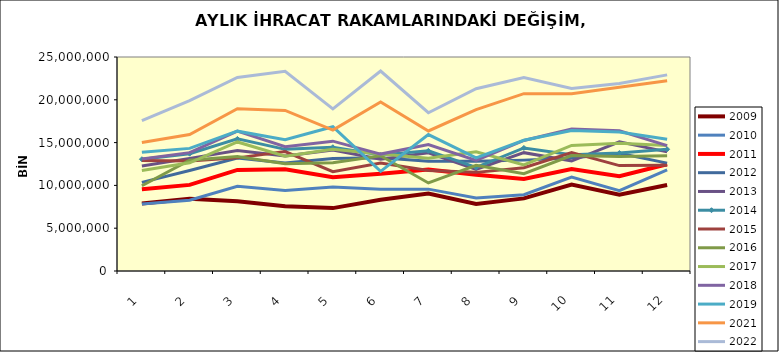
| Category | 2009 | 2010 | 2011 | 2012 | 2013 | 2014 | 2015 | 2016 | 2017 | 2018 | 2019 | 2021 | 2022 |
|---|---|---|---|---|---|---|---|---|---|---|---|---|---|
| 0 | 7884493.524 | 7828748.058 | 9551084.639 | 10348187.166 | 12263324.263 | 13056096.762 | 12910127.485 | 9956568.792 | 11738727.564 | 13080096.762 | 13874826.012 | 15003935.219 | 17553932.872 |
| 1 | 8435115.834 | 8263237.814 | 10059126.307 | 11748000.124 | 13155175.588 | 13707842.597 | 12846416.717 | 12939347.18 | 12643609.013 | 13827132.655 | 14323043.042 | 15952528.858 | 19904576.483 |
| 2 | 8155485.081 | 9886488.171 | 11811085.16 | 13208572.977 | 14066303.609 | 15431727.477 | 13215986.349 | 13384191.887 | 15075608.163 | 16338253.918 | 16335862.397 | 18955706.115 | 22609916.172 |
| 3 | 7561696.283 | 9396006.654 | 11873269.447 | 12630226.718 | 13450014.59 | 14209640.806 | 13953422.579 | 12533489.672 | 13420425.677 | 14530822.873 | 15340619.825 | 18756865.083 | 23332061.588 |
| 4 | 7346407.528 | 9799958.117 | 10943364.372 | 13131530.961 | 14141542.927 | 14460399.063 | 11607981.553 | 12637024.952 | 14213768.007 | 15166648.044 | 16855105.097 | 16468343.399 | 18935100.849 |
| 5 | 8329692.783 | 9542907.644 | 11349953.558 | 13231198.688 | 13053396.669 | 13554949.303 | 12606056.614 | 13465844.799 | 13671983.566 | 13657091.159 | 11634653.881 | 19740427.009 | 23360895.579 |
| 6 | 9055733.671 | 9564682.545 | 11860004.271 | 12830675.307 | 13804867.164 | 14039020.307 | 11745880.832 | 10286292.933 | 13179496.037 | 14771360.698 | 15932004.724 | 16357698.212 | 18490317.221 |
| 7 | 7839908.842 | 8523451.973 | 11245124.657 | 12831394.572 | 11859734.323 | 12095069.206 | 11522156.393 | 12342120.329 | 13916052.548 | 12926754.199 | 13222876.223 | 18860976.378 | 21291905.88 |
| 8 | 8480708.387 | 8909230.521 | 10750626.099 | 12952651.722 | 13824599.43 | 14376629.005 | 12065120.414 | 11376777.023 | 12391566.74 | 15247368.846 | 15273579.961 | 20715563.079 | 22594820.823 |
| 9 | 10095768.03 | 10963586.27 | 11907219.297 | 13190769.655 | 12846390.344 | 13573184.591 | 13838696.312 | 13491939.034 | 14672918.156 | 16590652.49 | 16410781.68 | 20713984.277 | 21321186.605 |
| 10 | 8903010.773 | 9382369.718 | 11078524.743 | 13753052.493 | 15100053.117 | 13782563.867 | 12311852.097 | 13378228.023 | 14909379.879 | 16386878.393 | 16242650.391 | 21455111.986 | 21900299.443 |
| 11 | 10054591.867 | 11822551.699 | 12477486.28 | 12605476.173 | 13915512.678 | 14217738.811 | 12358416.421 | 13455174.639 | 14661083.966 | 14645696.251 | 15386718.469 | 22233318.423 | 22914521.438 |